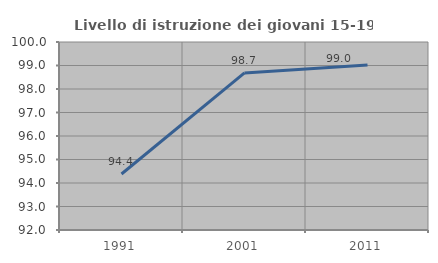
| Category | Livello di istruzione dei giovani 15-19 anni |
|---|---|
| 1991.0 | 94.382 |
| 2001.0 | 98.684 |
| 2011.0 | 99.02 |